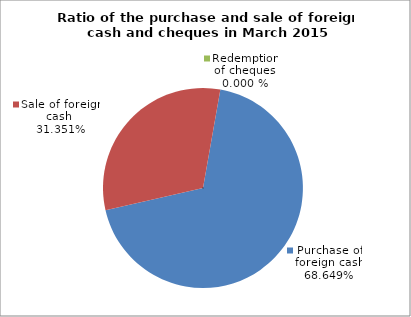
| Category | Purchase of foreign cash |
|---|---|
| 0 | 0.686 |
| 1 | 0.314 |
| 2 | 0 |